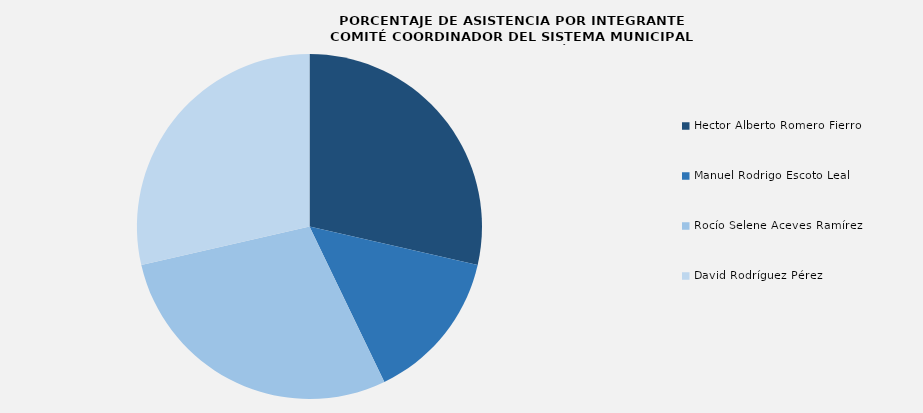
| Category | Series 0 |
|---|---|
| Hector Alberto Romero Fierro | 2 |
| Manuel Rodrigo Escoto Leal | 1 |
| Rocío Selene Aceves Ramírez | 2 |
| David Rodríguez Pérez | 2 |